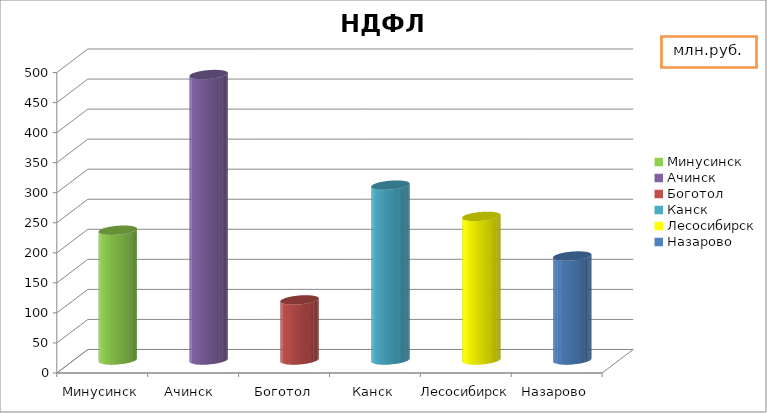
| Category | НДФЛ |
|---|---|
| Минусинск | 216 |
| Ачинск  | 475 |
| Боготол | 100 |
| Канск | 291 |
| Лесосибирск | 239 |
| Назарово | 173 |